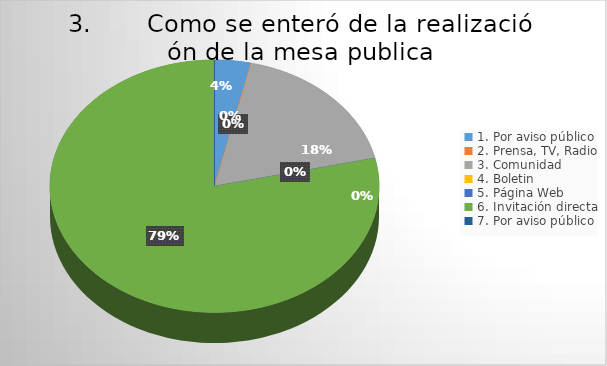
| Category | Series 0 |
|---|---|
| 1. Por aviso público | 1 |
| 2. Prensa, TV, Radio | 0 |
| 3. Comunidad | 5 |
| 4. Boletin | 0 |
| 5. Página Web | 0 |
| 6. Invitación directa | 22 |
| 7. Por aviso público | 0 |